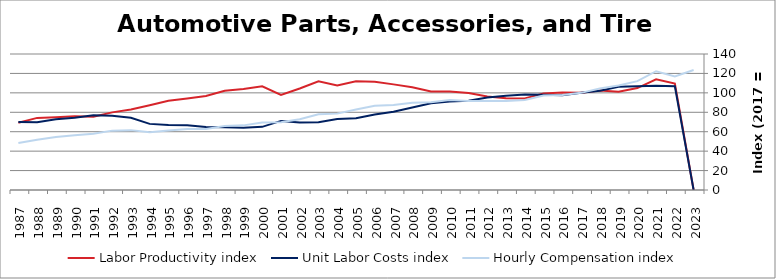
| Category | Labor Productivity index | Unit Labor Costs index | Hourly Compensation index |
|---|---|---|---|
| 2023.0 | 0 | 0 | 123.454 |
| 2022.0 | 109.546 | 106.799 | 116.994 |
| 2021.0 | 113.926 | 107.348 | 122.297 |
| 2020.0 | 104.911 | 106.783 | 112.028 |
| 2019.0 | 101.094 | 106.331 | 107.494 |
| 2018.0 | 102.331 | 102.176 | 104.557 |
| 2017.0 | 100 | 100 | 100 |
| 2016.0 | 100.332 | 97.58 | 97.903 |
| 2015.0 | 99.314 | 97.95 | 97.278 |
| 2014.0 | 94.126 | 98.326 | 92.55 |
| 2013.0 | 94.416 | 96.969 | 91.554 |
| 2012.0 | 96.27 | 95.216 | 91.665 |
| 2011.0 | 99.916 | 91.81 | 91.733 |
| 2010.0 | 101.497 | 91.168 | 92.532 |
| 2009.0 | 101.318 | 89.236 | 90.412 |
| 2008.0 | 105.696 | 85.027 | 89.871 |
| 2007.0 | 108.742 | 80.519 | 87.558 |
| 2006.0 | 111.482 | 77.8 | 86.734 |
| 2005.0 | 111.997 | 73.978 | 82.853 |
| 2004.0 | 107.586 | 73.077 | 78.62 |
| 2003.0 | 111.941 | 69.734 | 78.06 |
| 2002.0 | 104.55 | 69.613 | 72.78 |
| 2001.0 | 97.931 | 71.131 | 69.66 |
| 2000.0 | 106.732 | 65.004 | 69.38 |
| 1999.0 | 103.898 | 64.036 | 66.533 |
| 1998.0 | 102.127 | 64.576 | 65.95 |
| 1997.0 | 96.804 | 64.874 | 62.8 |
| 1996.0 | 94.27 | 66.676 | 62.856 |
| 1995.0 | 91.766 | 66.796 | 61.296 |
| 1994.0 | 87.278 | 68.069 | 59.409 |
| 1993.0 | 82.822 | 74.416 | 61.632 |
| 1992.0 | 79.911 | 76.485 | 61.12 |
| 1991.0 | 75.411 | 76.915 | 58.002 |
| 1990.0 | 75.838 | 74.353 | 56.387 |
| 1989.0 | 74.884 | 72.783 | 54.503 |
| 1988.0 | 74.232 | 69.75 | 51.777 |
| 1987.0 | 69.199 | 69.9 | 48.37 |